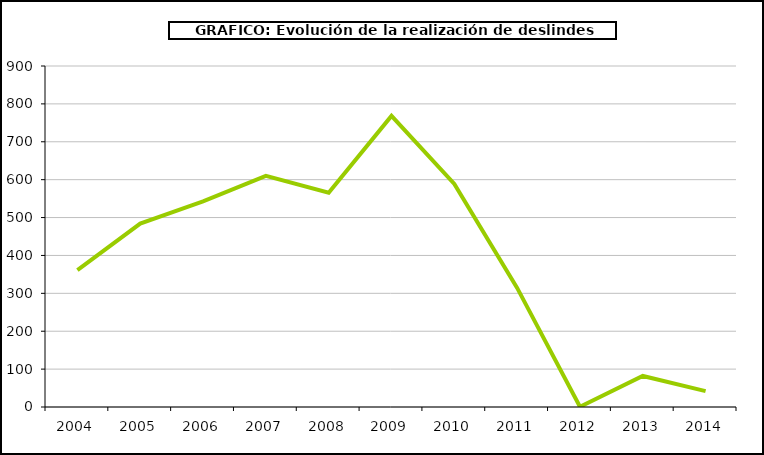
| Category | costal |
|---|---|
| 2004.0 | 360.999 |
| 2005.0 | 483.946 |
| 2006.0 | 542.899 |
| 2007.0 | 609.979 |
| 2008.0 | 565.426 |
| 2009.0 | 768.343 |
| 2010.0 | 588.854 |
| 2011.0 | 314.421 |
| 2012.0 | 0.6 |
| 2013.0 | 81.928 |
| 2014.0 | 41.8 |